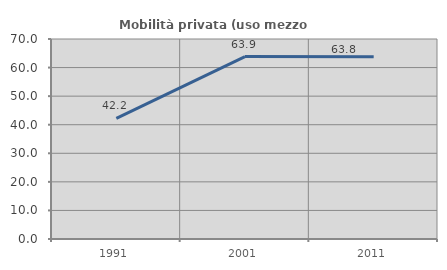
| Category | Mobilità privata (uso mezzo privato) |
|---|---|
| 1991.0 | 42.197 |
| 2001.0 | 63.855 |
| 2011.0 | 63.793 |